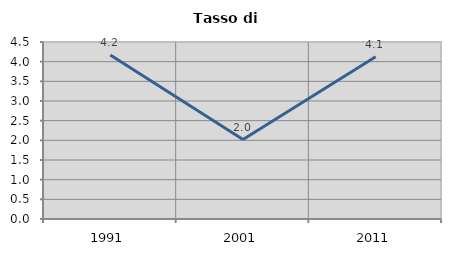
| Category | Tasso di disoccupazione   |
|---|---|
| 1991.0 | 4.167 |
| 2001.0 | 2.019 |
| 2011.0 | 4.127 |